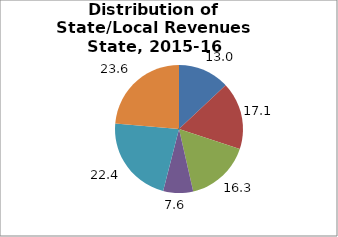
| Category | Series 0 |
|---|---|
| General Sales | 12.985 |
| Property | 17.105 |
| Income1 | 16.337 |
| Other | 7.564 |
| From Federal Government | 22.394 |
| Nontax Revenues2 | 23.615 |